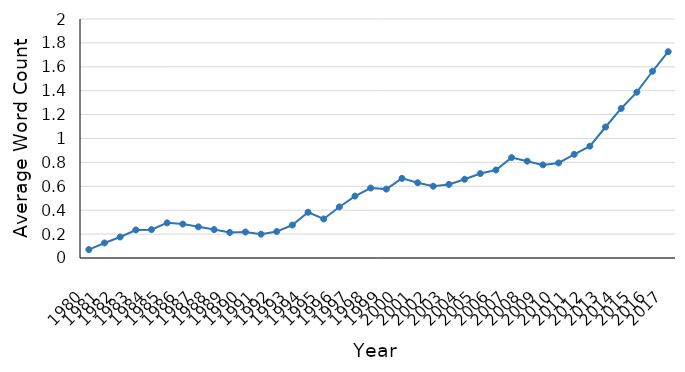
| Category | Graphical |
|---|---|
| 1980.0 | 0.07 |
| 1981.0 | 0.126 |
| 1982.0 | 0.176 |
| 1983.0 | 0.235 |
| 1984.0 | 0.237 |
| 1985.0 | 0.294 |
| 1986.0 | 0.284 |
| 1987.0 | 0.261 |
| 1988.0 | 0.238 |
| 1989.0 | 0.214 |
| 1990.0 | 0.217 |
| 1991.0 | 0.199 |
| 1992.0 | 0.221 |
| 1993.0 | 0.276 |
| 1994.0 | 0.383 |
| 1995.0 | 0.327 |
| 1996.0 | 0.427 |
| 1997.0 | 0.518 |
| 1998.0 | 0.586 |
| 1999.0 | 0.576 |
| 2000.0 | 0.666 |
| 2001.0 | 0.63 |
| 2002.0 | 0.601 |
| 2003.0 | 0.616 |
| 2004.0 | 0.659 |
| 2005.0 | 0.707 |
| 2006.0 | 0.736 |
| 2007.0 | 0.84 |
| 2008.0 | 0.81 |
| 2009.0 | 0.779 |
| 2010.0 | 0.795 |
| 2011.0 | 0.867 |
| 2012.0 | 0.936 |
| 2013.0 | 1.096 |
| 2014.0 | 1.251 |
| 2015.0 | 1.388 |
| 2016.0 | 1.563 |
| 2017.0 | 1.726 |